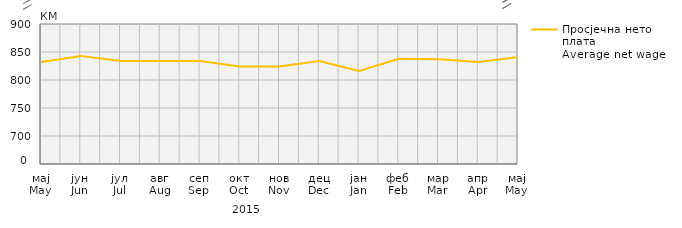
| Category | Просјечна нето плата
Average net wage |
|---|---|
| мај
May | 832 |
| јун
Jun | 843 |
| јул
Jul | 834 |
| авг
Aug | 834 |
| сеп
Sep | 834 |
| окт
Oct | 824 |
| нов
Nov | 824 |
| дец
Dec | 834 |
| јан
Jan | 816 |
| феб
Feb | 838 |
| мар
Mar | 837 |
| апр
Apr | 832 |
| мај
May | 841 |